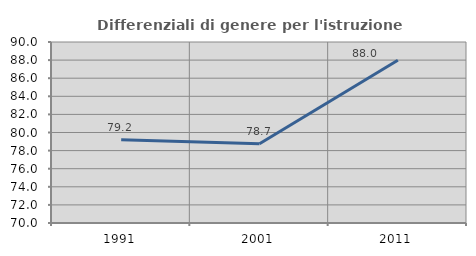
| Category | Differenziali di genere per l'istruzione superiore |
|---|---|
| 1991.0 | 79.2 |
| 2001.0 | 78.747 |
| 2011.0 | 87.989 |